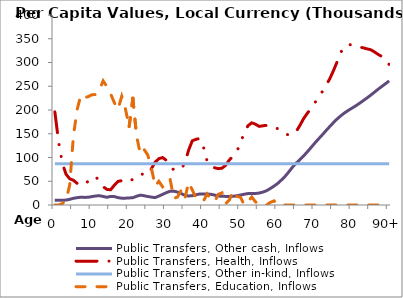
| Category | Public Transfers, Other cash, Inflows | Public Transfers, Health, Inflows | Public Transfers, Other in-kind, Inflows | Public Transfers, Education, Inflows |
|---|---|---|---|---|
| 0 | 10149.476 | 196111.92 | 86906.527 | 0 |
|  | 10189.693 | 133436.5 | 86906.527 | 0 |
| 2 | 10144.206 | 88632.806 | 86906.527 | 2749.898 |
| 3 | 10313.127 | 64920.223 | 86906.527 | 9303.454 |
| 4 | 11938.633 | 55181.159 | 86906.527 | 42082.676 |
| 5 | 14122.723 | 52090.713 | 86906.527 | 145768.31 |
| 6 | 15428.77 | 45502.735 | 86906.527 | 200975.66 |
| 7 | 16458.663 | 41794.125 | 86906.527 | 231287.96 |
| 8 | 15959.347 | 42657.942 | 86906.527 | 225650.13 |
| 9 | 16351.943 | 50692.114 | 86906.527 | 228395.46 |
| 10 | 17729.156 | 58287.313 | 86906.527 | 232266.07 |
| 11 | 19000.545 | 59000.461 | 86906.527 | 232443.66 |
| 12 | 19628.346 | 51262.619 | 86906.527 | 242445.27 |
| 13 | 17944.093 | 38568.938 | 86906.527 | 261364.68 |
| 14 | 16256.493 | 32911.893 | 86906.527 | 249433.52 |
| 15 | 18078.497 | 32064.109 | 86906.527 | 234573.27 |
| 16 | 17728.156 | 41484.848 | 86906.527 | 215546.05 |
| 17 | 15534.555 | 49717.776 | 86906.527 | 201323.49 |
| 18 | 14335.484 | 51174.337 | 86906.527 | 228733.26 |
| 19 | 14393.584 | 48600.894 | 86906.527 | 202409.39 |
| 20 | 14864.97 | 48534.251 | 86906.527 | 165141.95 |
| 21 | 15389.775 | 54552.955 | 86906.527 | 224898.38 |
| 22 | 18345.714 | 60771.749 | 86906.527 | 146022.94 |
| 23 | 20775.012 | 64640.351 | 86906.527 | 107446.32 |
| 24 | 19516.438 | 65148.004 | 86906.527 | 117239.58 |
| 25 | 17938.266 | 63654.351 | 86906.527 | 105371.31 |
| 26 | 16597.629 | 76349.219 | 86906.527 | 77657.734 |
| 27 | 15565.328 | 90255.966 | 86906.527 | 39655.779 |
| 28 | 18803.12 | 97536.758 | 86906.527 | 49882.416 |
| 29 | 22344.183 | 99927.92 | 86906.527 | 38287.938 |
| 30 | 25967.269 | 94199.243 | 86906.527 | 45712.891 |
| 31 | 28910.784 | 81958.356 | 86906.527 | 55668.064 |
| 32 | 29239.498 | 74126.43 | 86906.527 | 14228.037 |
| 33 | 27233.688 | 74006.099 | 86906.527 | 16535.215 |
| 34 | 24049.962 | 75603.174 | 86906.527 | 30758.735 |
| 35 | 20539.725 | 87825.678 | 86906.527 | 12845.249 |
| 36 | 19003.078 | 115337.87 | 86906.527 | 47948.526 |
| 37 | 19620.894 | 135203.75 | 86906.527 | 31522.209 |
| 38 | 21461.306 | 138272.71 | 86906.527 | 15474.179 |
| 39 | 23248.641 | 139975.02 | 86906.527 | 10169.761 |
| 40 | 23416.34 | 122041.09 | 86906.527 | 8097.68 |
| 41 | 23157.844 | 92184.525 | 86906.527 | 23176.603 |
| 42 | 22541.714 | 80824.629 | 86906.527 | 12375.153 |
| 43 | 20813.544 | 78460.151 | 86906.527 | 6962.885 |
| 44 | 19029.988 | 76481.557 | 86906.527 | 22392.899 |
| 45 | 18193.969 | 77513.979 | 86906.527 | 25551.145 |
| 46 | 18146.602 | 83794.306 | 86906.527 | 2777.432 |
| 47 | 17962.463 | 94955.27 | 86906.527 | 10778.687 |
| 48 | 18253.905 | 102668.95 | 86906.527 | 30088.741 |
| 49 | 19544.125 | 112713.08 | 86906.527 | 18141.171 |
| 50 | 20991.262 | 131754.64 | 86906.527 | 16182.113 |
| 51 | 22718.691 | 152124.29 | 86906.527 | 0 |
| 52 | 24054.644 | 166955.4 | 86906.527 | 7059.687 |
| 53 | 24233.815 | 172923.77 | 86906.527 | 16862.903 |
| 54 | 24174.212 | 170165.72 | 86906.527 | 6806.646 |
| 55 | 25164.53 | 165512.96 | 86906.527 | 0 |
| 56 | 27213.482 | 166740 | 86906.527 | 0 |
| 57 | 30040.486 | 167770.3 | 86906.527 | 0 |
| 58 | 34725.88 | 167578.15 | 86906.527 | 5450.643 |
| 59 | 39700.285 | 164910.7 | 86906.527 | 8681.062 |
| 60 | 45502.351 | 160478.57 | 86906.527 | 0 |
| 61 | 52620.972 | 153673.26 | 86906.527 | 0 |
| 62 | 60463.47 | 150367.63 | 86906.527 | 0 |
| 63 | 69920.358 | 147040.69 | 86906.527 | 0 |
| 64 | 79830.501 | 149456.07 | 86906.527 | 0 |
| 65 | 88301.473 | 155007.84 | 86906.527 | 0 |
| 66 | 95787.851 | 167907.78 | 86906.527 | 0 |
| 67 | 103468.73 | 182239.88 | 86906.527 | 0 |
| 68 | 112208.12 | 193434.12 | 86906.527 | 0 |
| 69 | 121269.65 | 203943.82 | 86906.527 | 0 |
| 70 | 130441.48 | 215342.29 | 86906.527 | 0 |
| 71 | 139155.73 | 226455.29 | 86906.527 | 0 |
| 72 | 147702.95 | 238722.33 | 86906.527 | 0 |
| 73 | 156540.61 | 251824.56 | 86906.527 | 0 |
| 74 | 165050.09 | 265451.3 | 86906.527 | 0 |
| 75 | 173363.04 | 282736.43 | 86906.527 | 0 |
| 76 | 181100.55 | 301546.71 | 86906.527 | 0 |
| 77 | 187935.22 | 321882.04 | 86906.527 | 0 |
| 78 | 193960.86 | 331897.28 | 86906.527 | 0 |
| 79 | 199185.91 | 338551.05 | 86906.527 | 0 |
| 80 | 203930.91 | 336492.86 | 86906.527 | 0 |
| 81 | 208774.33 | 333234.66 | 86906.527 | 0 |
| 82 | 214009.11 | 332729.15 | 86906.527 | 0 |
| 83 | 219516.58 | 330940.97 | 86906.527 | 0 |
| 84 | 225178.17 | 328789.16 | 86906.527 | 0 |
| 85 | 230990.8 | 327028.05 | 86906.527 | 0 |
| 86 | 237303.24 | 322566.79 | 86906.527 | 0 |
| 87 | 243534.1 | 317209.81 | 86906.527 | 0 |
| 88 | 249448.38 | 312823.35 | 86906.527 | 0 |
| 89 | 255233.82 | 307702.77 | 86906.527 | 0 |
| 90+ | 261273.66 | 295629.9 | 86906.527 | 0 |